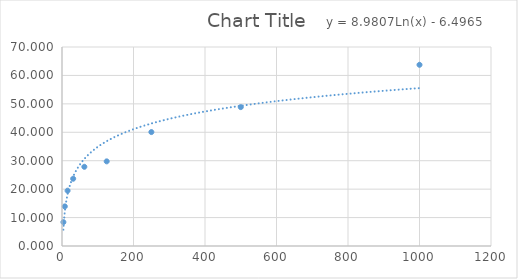
| Category | Series 0 |
|---|---|
| 3.91 | 8.397 |
| 7.81 | 13.931 |
| 15.62 | 19.466 |
| 31.25 | 23.664 |
| 62.5 | 27.863 |
| 125.0 | 29.771 |
| 250.0 | 40.076 |
| 500.0 | 48.855 |
| 1000.0 | 63.74 |